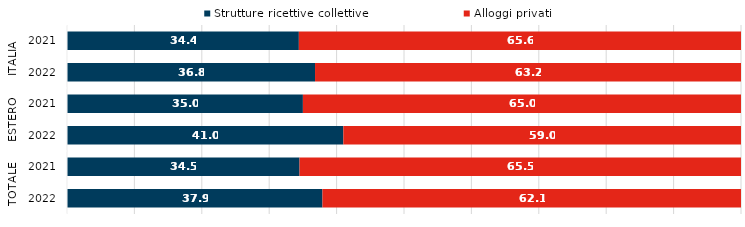
| Category | Strutture ricettive collettive | Alloggi privati |
|---|---|---|
| 0 | 34.4 | 65.6 |
| 1 | 36.8 | 63.2 |
| 2 | 35 | 65 |
| 3 | 41 | 59 |
| 4 | 34.5 | 65.5 |
| 5 | 37.9 | 62.1 |